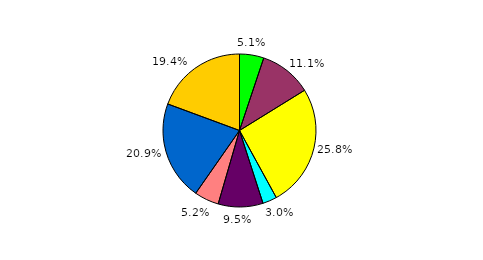
| Category | Series 0 |
|---|---|
| 0 | 5.14 |
| 1 | 11.049 |
| 2 | 25.826 |
| 3 | 3.017 |
| 4 | 9.464 |
| 5 | 5.198 |
| 6 | 20.936 |
| 7 | 19.37 |